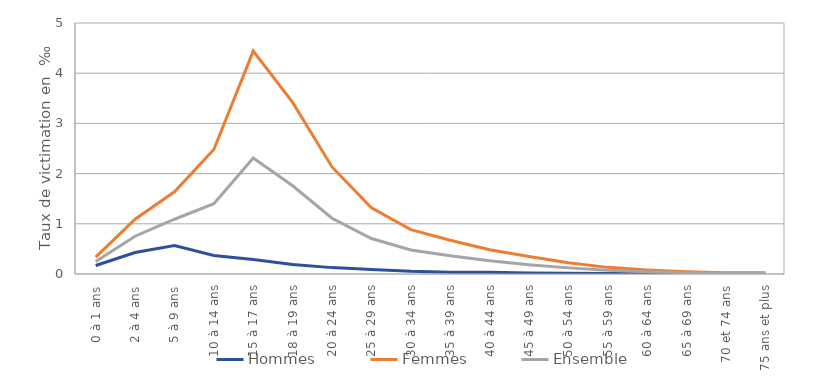
| Category | Hommes | Femmes | Ensemble |
|---|---|---|---|
| 0 à 1 ans | 0.169 | 0.336 | 0.251 |
| 2 à 4 ans | 0.427 | 1.092 | 0.752 |
| 5 à 9 ans | 0.567 | 1.638 | 1.091 |
| 10 à 14 ans | 0.37 | 2.481 | 1.401 |
| 15 à 17 ans | 0.288 | 4.44 | 2.309 |
| 18 à 19 ans | 0.188 | 3.419 | 1.757 |
| 20 à 24 ans | 0.127 | 2.133 | 1.11 |
| 25 à 29 ans | 0.088 | 1.317 | 0.707 |
| 30 à 34 ans | 0.054 | 0.883 | 0.479 |
| 35 à 39 ans | 0.037 | 0.673 | 0.364 |
| 40 à 44 ans | 0.035 | 0.485 | 0.264 |
| 45 à 49 ans | 0.018 | 0.35 | 0.186 |
| 50 à 54 ans | 0.015 | 0.226 | 0.122 |
| 55 à 59 ans | 0.011 | 0.132 | 0.073 |
| 60 à 64 ans | 0.006 | 0.08 | 0.045 |
| 65 à 69 ans | 0.004 | 0.046 | 0.026 |
| 70 et 74 ans | 0.003 | 0.025 | 0.015 |
| 75 ans et plus | 0.003 | 0.024 | 0.016 |